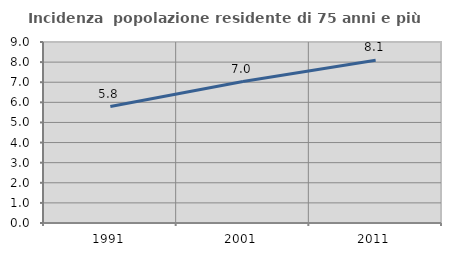
| Category | Incidenza  popolazione residente di 75 anni e più |
|---|---|
| 1991.0 | 5.79 |
| 2001.0 | 7.031 |
| 2011.0 | 8.09 |